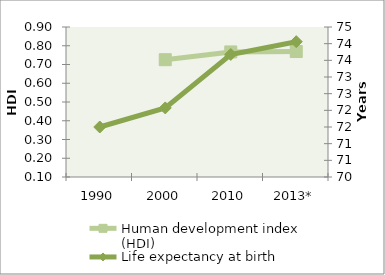
| Category | Human development index (HDI) |
|---|---|
| 1990 | 0 |
| 2000 | 0.726 |
| 2010 | 0.767 |
| 2013* | 0.769 |